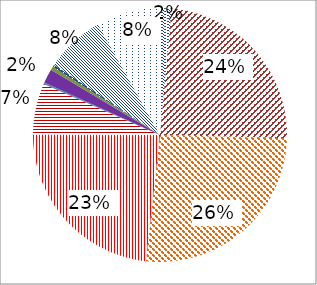
| Category | Series 0 |
|---|---|
| Fixed-line phone | 30315484993 |
| Cable Modem | 490449818869 |
| DSL | 540327775951 |
| FTTH/B | 476836908491 |
| OtherInternet/unidntf. | 133853524996 |
| 1Gmobile analog voice | 35076919 |
| 2 G mobile voice | 3713778974 |
| 2.5G mobile voice | 37003679213 |
| 3G mobile voice | 9348855554 |
| 2G mobile data | 5919966101 |
| 2.5G mobile data | 154855257640 |
| 3G mobile data | 166517063970 |